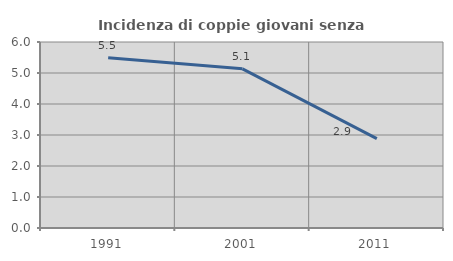
| Category | Incidenza di coppie giovani senza figli |
|---|---|
| 1991.0 | 5.489 |
| 2001.0 | 5.134 |
| 2011.0 | 2.882 |